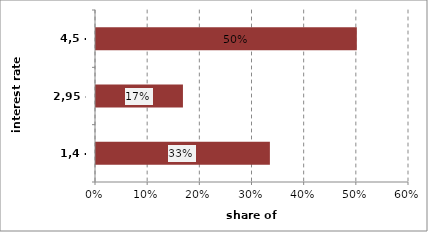
| Category | Series 0 |
|---|---|
| 1,4 - 2,95 | 0.333 |
| 2,95 - 4,5 | 0.167 |
| 4,5 - 6,05 | 0.5 |